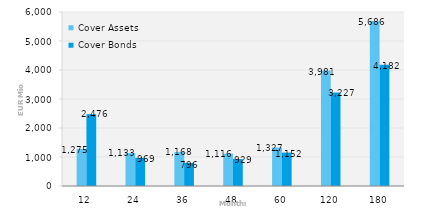
| Category | Cover Assets | Cover Bonds |
|---|---|---|
| 12.0 | 1275.397 | 2476.125 |
| 24.0 | 1133.238 | 969.28 |
| 36.0 | 1168.142 | 796 |
| 48.0 | 1115.513 | 929.102 |
| 60.0 | 1327.185 | 1151.535 |
| 120.0 | 3980.588 | 3226.694 |
| 180.0 | 5686.116 | 4181.534 |